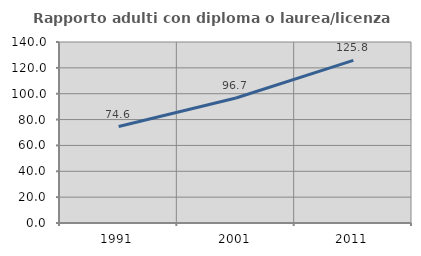
| Category | Rapporto adulti con diploma o laurea/licenza media  |
|---|---|
| 1991.0 | 74.583 |
| 2001.0 | 96.724 |
| 2011.0 | 125.79 |